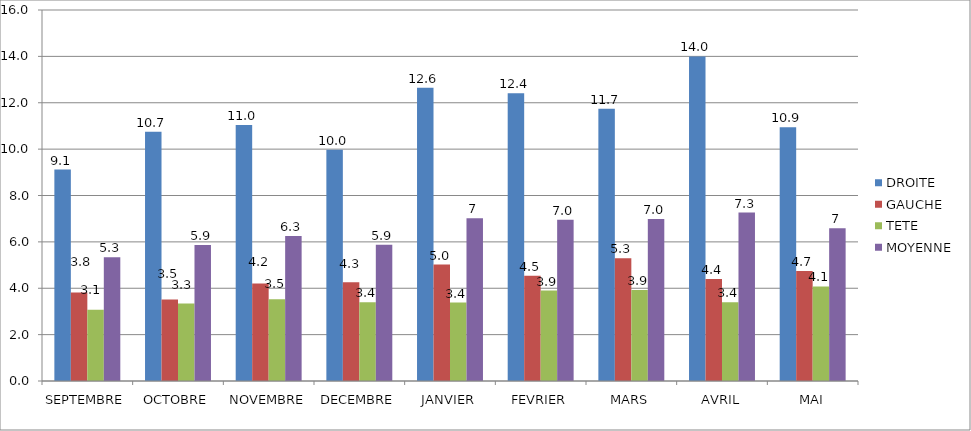
| Category | DROITE | GAUCHE | TETE | MOYENNE |
|---|---|---|---|---|
| SEPTEMBRE | 9.116 | 3.814 | 3.07 | 5.333 |
| OCTOBRE | 10.745 | 3.511 | 3.34 | 5.865 |
| NOVEMBRE | 11.045 | 4.205 | 3.523 | 6.258 |
| DECEMBRE | 9.971 | 4.257 | 3.4 | 5.876 |
| JANVIER | 12.643 | 5.024 | 3.381 | 7.016 |
| FEVRIER | 12.415 | 4.537 | 3.902 | 6.951 |
| MARS | 11.745 | 5.294 | 3.922 | 6.987 |
| AVRIL | 14 | 4.4 | 3.4 | 7.267 |
| MAI | 10.941 | 4.745 | 4.078 | 6.588 |